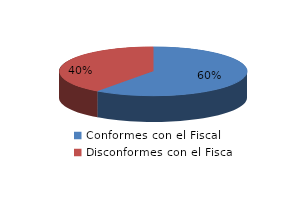
| Category | Series 0 |
|---|---|
| 0 | 15 |
| 1 | 10 |